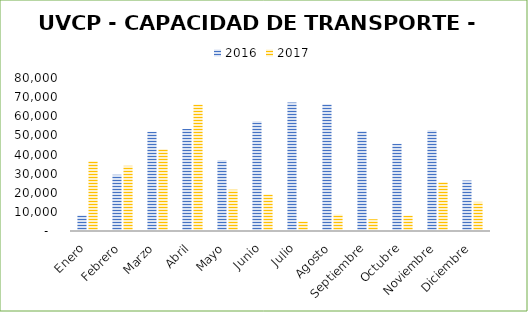
| Category | 2016 | 2017 |
|---|---|---|
| Enero | 8169 | 36524 |
| Febrero | 29416 | 34095 |
| Marzo | 51898 | 42766 |
| Abril | 53293 | 66129 |
| Mayo | 37068 | 21606 |
| Junio | 57375 | 19145 |
| Julio | 67186 | 5004 |
| Agosto | 66293 | 8587 |
| Septiembre | 52211 | 6145 |
| Octubre | 45590 | 8079 |
| Noviembre | 52618 | 25585 |
| Diciembre | 26398 | 15242 |